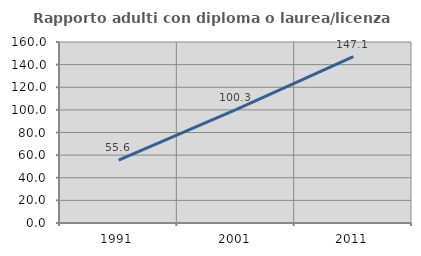
| Category | Rapporto adulti con diploma o laurea/licenza media  |
|---|---|
| 1991.0 | 55.573 |
| 2001.0 | 100.25 |
| 2011.0 | 147.093 |